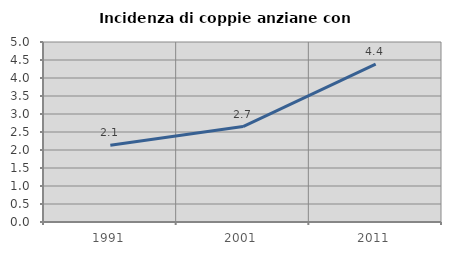
| Category | Incidenza di coppie anziane con figli |
|---|---|
| 1991.0 | 2.133 |
| 2001.0 | 2.651 |
| 2011.0 | 4.386 |